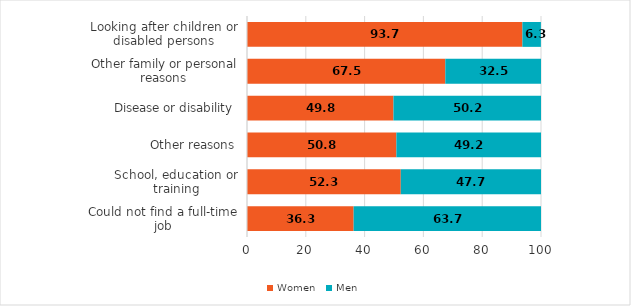
| Category | Women | Men |
|---|---|---|
| Could not find a full-time job | 36.27 | 63.73 |
| School, education or training | 52.305 | 47.695 |
| Other reasons | 50.81 | 49.19 |
| Disease or disability | 49.818 | 50.182 |
| Other family or personal reasons | 67.45 | 32.55 |
| Looking after children or disabled persons | 93.668 | 6.3 |